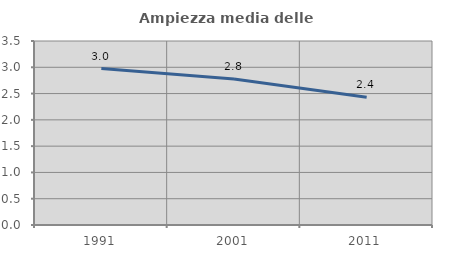
| Category | Ampiezza media delle famiglie |
|---|---|
| 1991.0 | 2.975 |
| 2001.0 | 2.775 |
| 2011.0 | 2.431 |